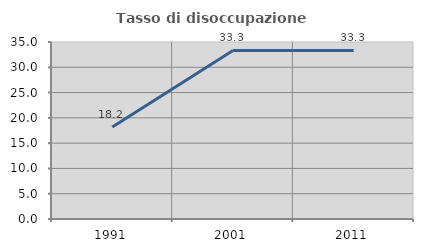
| Category | Tasso di disoccupazione giovanile  |
|---|---|
| 1991.0 | 18.182 |
| 2001.0 | 33.333 |
| 2011.0 | 33.333 |